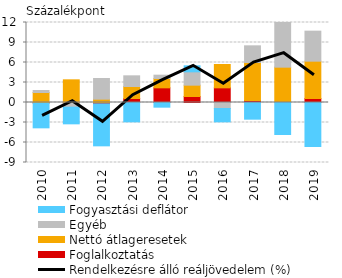
| Category | Foglalkoztatás | Nettó átlageresetek | Egyéb | Fogyasztási deflátor |
|---|---|---|---|---|
| 2010.0 | -0.1 | 1.5 | 0.3 | -3.7 |
| 2011.0 | -0.1 | 3.4 | -0.6 | -2.5 |
| 2012.0 | -0.2 | 0.5 | 3.1 | -6.3 |
| 2013.0 | 0.6 | 1.8 | 1.6 | -2.9 |
| 2014.0 | 2.2 | 1.4 | 0.5 | -0.7 |
| 2015.0 | 0.9 | 1.7 | 2 | 0.9 |
| 2016.0 | 2.2 | 3.5 | -0.9 | -2 |
| 2017.0 | 0.3 | 5.7 | 2.5 | -2.5 |
| 2018.0 | 0 | 5.3 | 6.9 | -4.8 |
| 2019.0 | 0.6 | 5.6 | 4.5 | -6.6 |